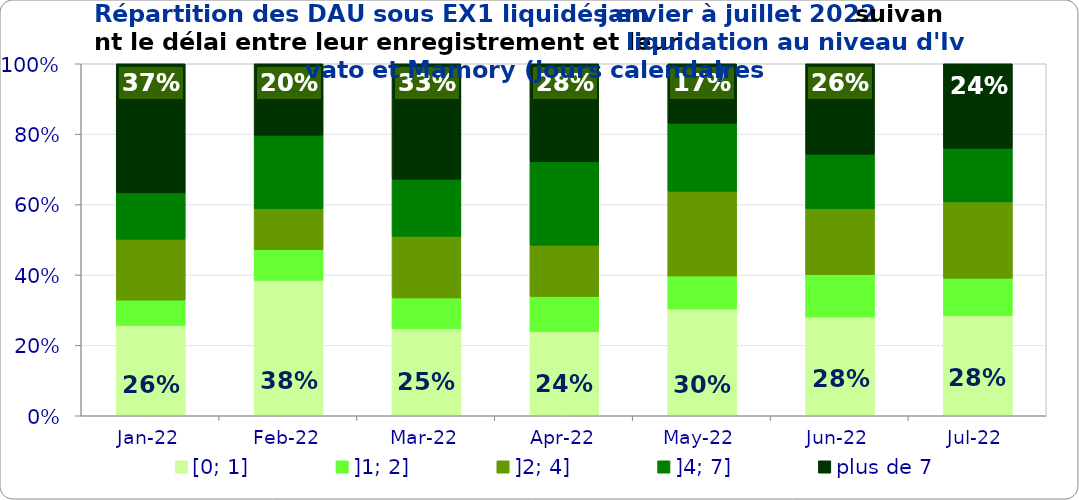
| Category | [0; 1] | ]1; 2] | ]2; 4] | ]4; 7] | plus de 7 |
|---|---|---|---|---|---|
| 2022-01-01 | 0.257 | 0.072 | 0.173 | 0.132 | 0.367 |
| 2022-02-01 | 0.385 | 0.087 | 0.117 | 0.208 | 0.203 |
| 2022-03-01 | 0.247 | 0.087 | 0.175 | 0.162 | 0.328 |
| 2022-04-01 | 0.239 | 0.1 | 0.146 | 0.237 | 0.279 |
| 2022-05-01 | 0.303 | 0.094 | 0.24 | 0.193 | 0.169 |
| 2022-06-01 | 0.281 | 0.121 | 0.187 | 0.155 | 0.257 |
| 2022-07-01 | 0.285 | 0.106 | 0.217 | 0.152 | 0.24 |